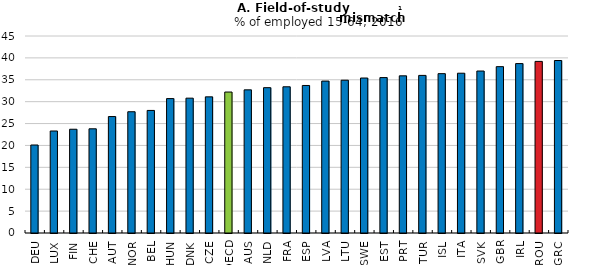
| Category | Series1 |
|---|---|
| DEU | 20.1 |
| LUX | 23.3 |
| FIN | 23.7 |
| CHE | 23.8 |
| AUT | 26.6 |
| NOR | 27.7 |
| BEL | 28 |
| HUN | 30.7 |
| DNK | 30.8 |
| CZE | 31.1 |
| OECD | 32.2 |
| AUS | 32.7 |
| NLD | 33.2 |
| FRA | 33.4 |
| ESP | 33.7 |
| LVA | 34.7 |
| LTU | 34.9 |
| SWE | 35.4 |
| EST | 35.5 |
| PRT | 35.9 |
| TUR | 36 |
| ISL | 36.4 |
| ITA | 36.5 |
| SVK | 37 |
| GBR | 38 |
| IRL | 38.7 |
| ROU | 39.2 |
| GRC | 39.4 |